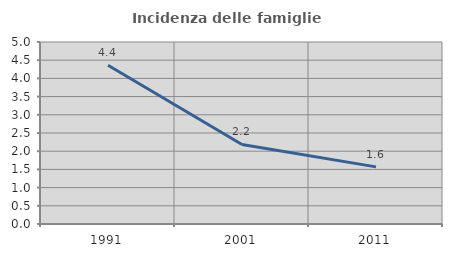
| Category | Incidenza delle famiglie numerose |
|---|---|
| 1991.0 | 4.359 |
| 2001.0 | 2.184 |
| 2011.0 | 1.569 |